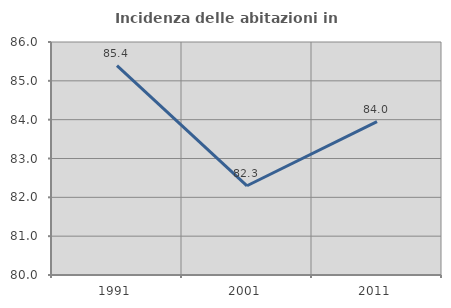
| Category | Incidenza delle abitazioni in proprietà  |
|---|---|
| 1991.0 | 85.393 |
| 2001.0 | 82.298 |
| 2011.0 | 83.951 |